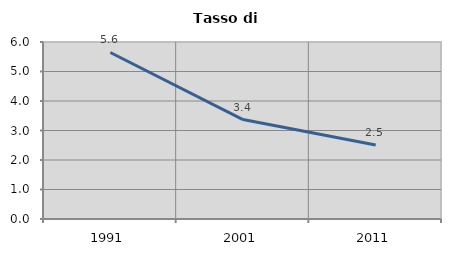
| Category | Tasso di disoccupazione   |
|---|---|
| 1991.0 | 5.645 |
| 2001.0 | 3.371 |
| 2011.0 | 2.512 |